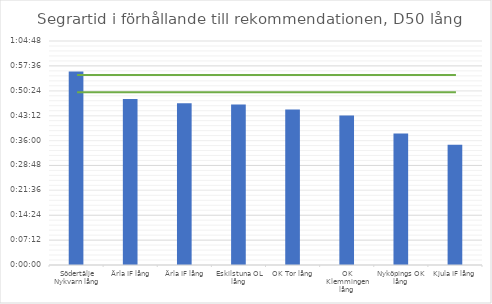
| Category | D50 tid |
|---|---|
| Södertälje Nykvarn lång | 0.039 |
| Ärla IF lång | 0.033 |
| Ärla IF lång | 0.032 |
| Eskilstuna OL lång | 0.032 |
| OK Tor lång | 0.031 |
| OK Klemmingen lång | 0.03 |
| Nyköpings OK lång | 0.026 |
| Kjula IF lång | 0.024 |